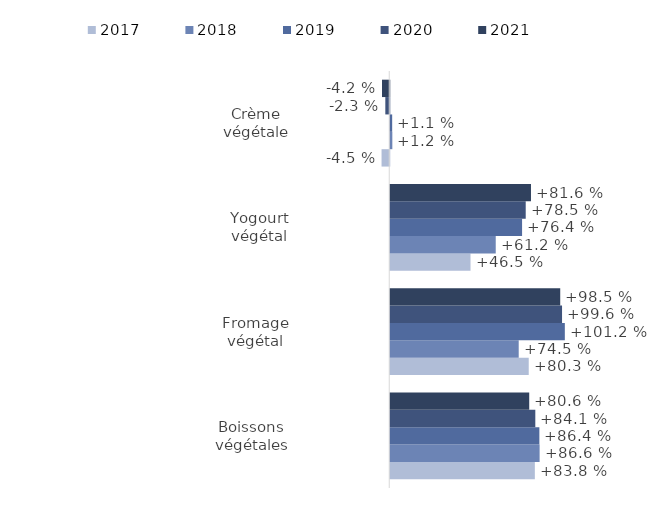
| Category | 2017 | 2018 | 2019 | 2020 | 2021 |
|---|---|---|---|---|---|
| Boissons végétales | 0.838 | 0.866 | 0.864 | 0.841 | 0.806 |
| Fromage végétal | 0.803 | 0.745 | 1.012 | 0.996 | 0.985 |
| Yogourt végétal | 0.465 | 0.612 | 0.764 | 0.785 | 0.816 |
| Crème végétale | -0.045 | 0.012 | 0.011 | -0.023 | -0.042 |